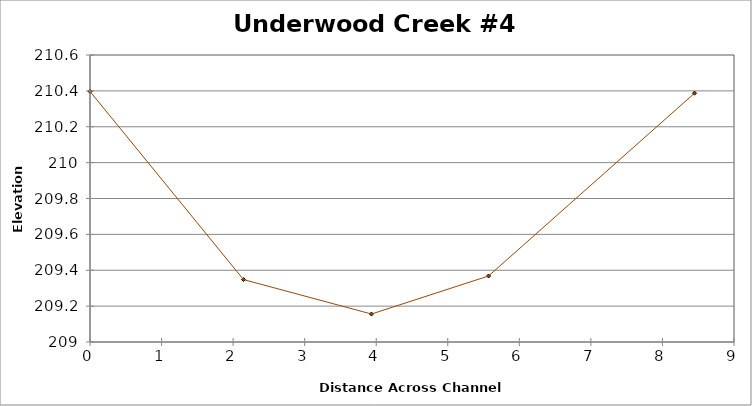
| Category | Series 0 |
|---|---|
| 0.0 | 210.397 |
| 2.1452498688970776 | 209.348 |
| 3.9333350987706286 | 209.156 |
| 5.570022980189555 | 209.368 |
| 8.448005977785664 | 210.387 |